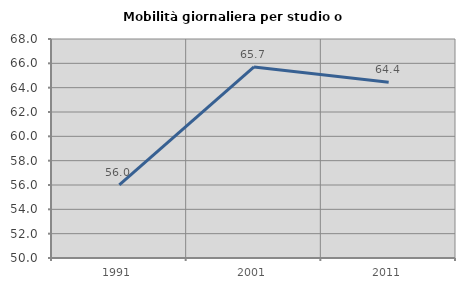
| Category | Mobilità giornaliera per studio o lavoro |
|---|---|
| 1991.0 | 56.013 |
| 2001.0 | 65.708 |
| 2011.0 | 64.438 |